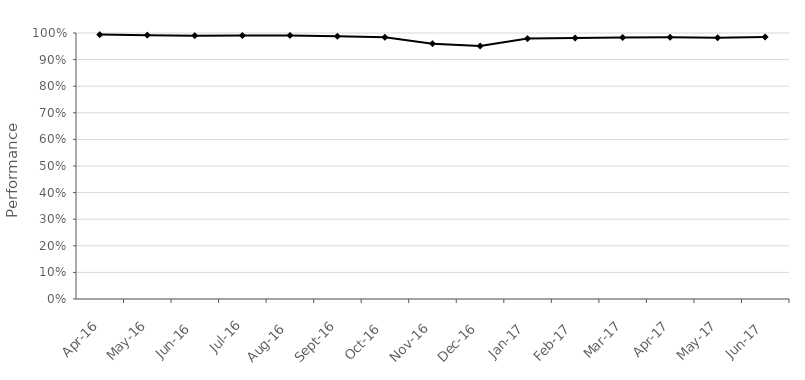
| Category | SL 4A |
|---|---|
| 2016-04-01 | 0.994 |
| 2016-05-01 | 0.992 |
| 2016-06-01 | 0.99 |
| 2016-07-01 | 0.991 |
| 2016-08-01 | 0.991 |
| 2016-09-01 | 0.988 |
| 2016-10-01 | 0.984 |
| 2016-11-01 | 0.96 |
| 2016-12-01 | 0.951 |
| 2017-01-01 | 0.979 |
| 2017-02-01 | 0.981 |
| 2017-03-01 | 0.983 |
| 2017-04-01 | 0.984 |
| 2017-05-01 | 0.982 |
| 2017-06-01 | 0.985 |